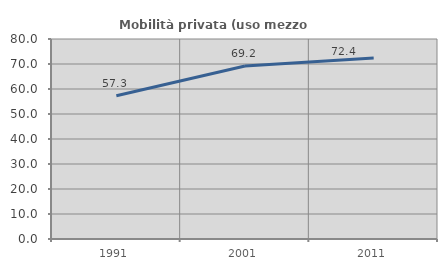
| Category | Mobilità privata (uso mezzo privato) |
|---|---|
| 1991.0 | 57.278 |
| 2001.0 | 69.189 |
| 2011.0 | 72.355 |